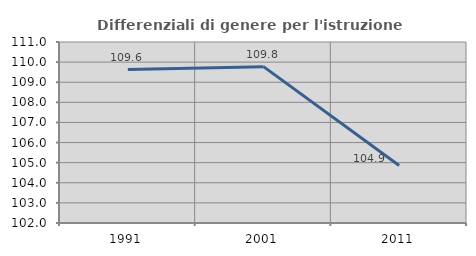
| Category | Differenziali di genere per l'istruzione superiore |
|---|---|
| 1991.0 | 109.629 |
| 2001.0 | 109.775 |
| 2011.0 | 104.863 |